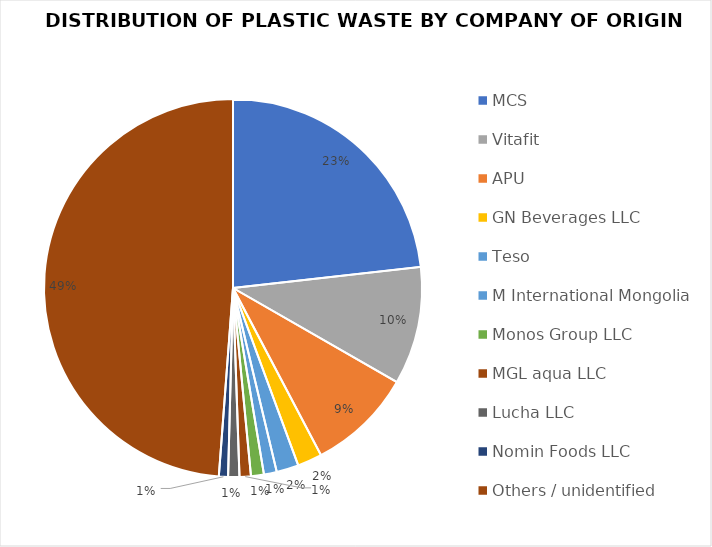
| Category | Series 0 |
|---|---|
| MCS | 114.863 |
| Vitafit | 49.825 |
| APU | 44.518 |
| GN Beverages LLC | 10.4 |
| Teso | 9.358 |
| M International Mongolia | 5.438 |
| Monos Group LLC | 5.45 |
| MGL aqua LLC | 4.8 |
| Lucha LLC | 4.76 |
| Nomin Foods LLC | 3.866 |
| Others / unidentified | 241.44 |